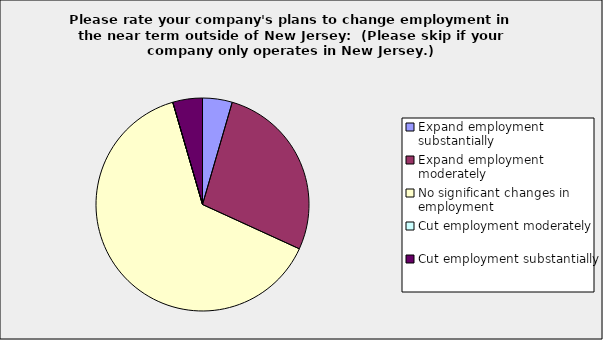
| Category | Series 0 |
|---|---|
| Expand employment substantially | 0.045 |
| Expand employment moderately | 0.273 |
| No significant changes in employment | 0.636 |
| Cut employment moderately | 0 |
| Cut employment substantially | 0.045 |